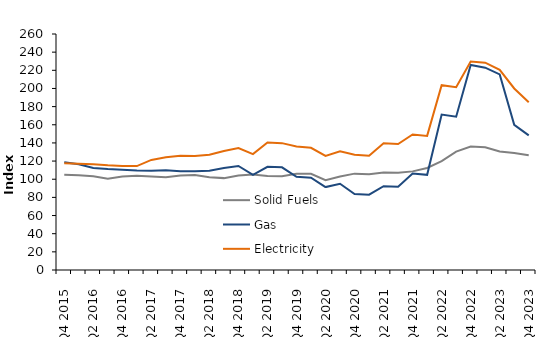
| Category | Solid Fuels | Gas | Electricity |
|---|---|---|---|
| Q4 2015 | 104.998 | 118.757 | 117.735 |
| Q1 2016 | 104.436 | 116.552 | 117.105 |
| Q2 2016 | 103.17 | 112.327 | 116.497 |
| Q3 2016 | 100.651 | 111.259 | 115.39 |
| Q4 2016 | 103.076 | 110.559 | 114.663 |
| Q1 2017 | 103.755 | 109.51 | 114.523 |
| Q2 2017 | 102.943 | 109.274 | 121.273 |
| Q3 2017 | 102.127 | 109.867 | 124.232 |
| Q4 2017 | 104.088 | 108.846 | 125.794 |
| Q1 2018 | 104.775 | 108.854 | 125.535 |
| Q2 2018 | 102.239 | 109.458 | 126.897 |
| Q3 2018 | 101.223 | 112.468 | 131.166 |
| Q4 2018 | 104.039 | 114.642 | 134.316 |
| Q1 2019 | 105.21 | 104.83 | 127.649 |
| Q2 2019 | 103.588 | 113.721 | 140.463 |
| Q3 2019 | 103.265 | 113.154 | 139.763 |
| Q4 2019 | 106.022 | 102.632 | 135.999 |
| Q1 2020 | 106.03 | 101.625 | 134.664 |
| Q2 2020 | 99.027 | 91.355 | 125.633 |
| Q3 2020 | 103.079 | 94.985 | 130.669 |
| Q4 2020 | 106.164 | 83.699 | 126.876 |
| Q1 2021 | 105.535 | 82.986 | 125.794 |
| Q2 2021 | 107.449 | 92.278 | 139.562 |
| Q3 2021 | 107.009 | 91.66 | 138.838 |
| Q4 2021 | 108.653 | 106.198 | 149.317 |
| Q1 2022 | 112.389 | 104.817 | 147.739 |
| Q2 2022 | 119.899 | 171.251 | 203.577 |
| Q3 2022 | 130.483 | 168.834 | 201.35 |
| Q4 2022 | 135.959 | 225.858 | 229.713 |
| Q1 2023 | 135.321 | 222.927 | 228.403 |
| Q2 2023 | 130.562 | 215.461 | 220.595 |
| Q3 2023 | 128.925 | 159.88 | 200.005 |
| Q4 2023 | 126.514 | 148.367 | 184.72 |